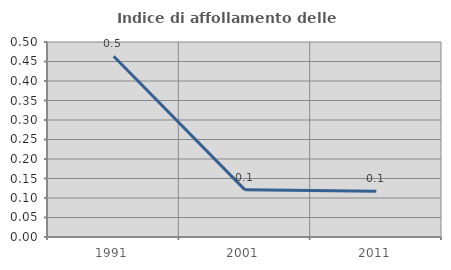
| Category | Indice di affollamento delle abitazioni  |
|---|---|
| 1991.0 | 0.463 |
| 2001.0 | 0.121 |
| 2011.0 | 0.117 |